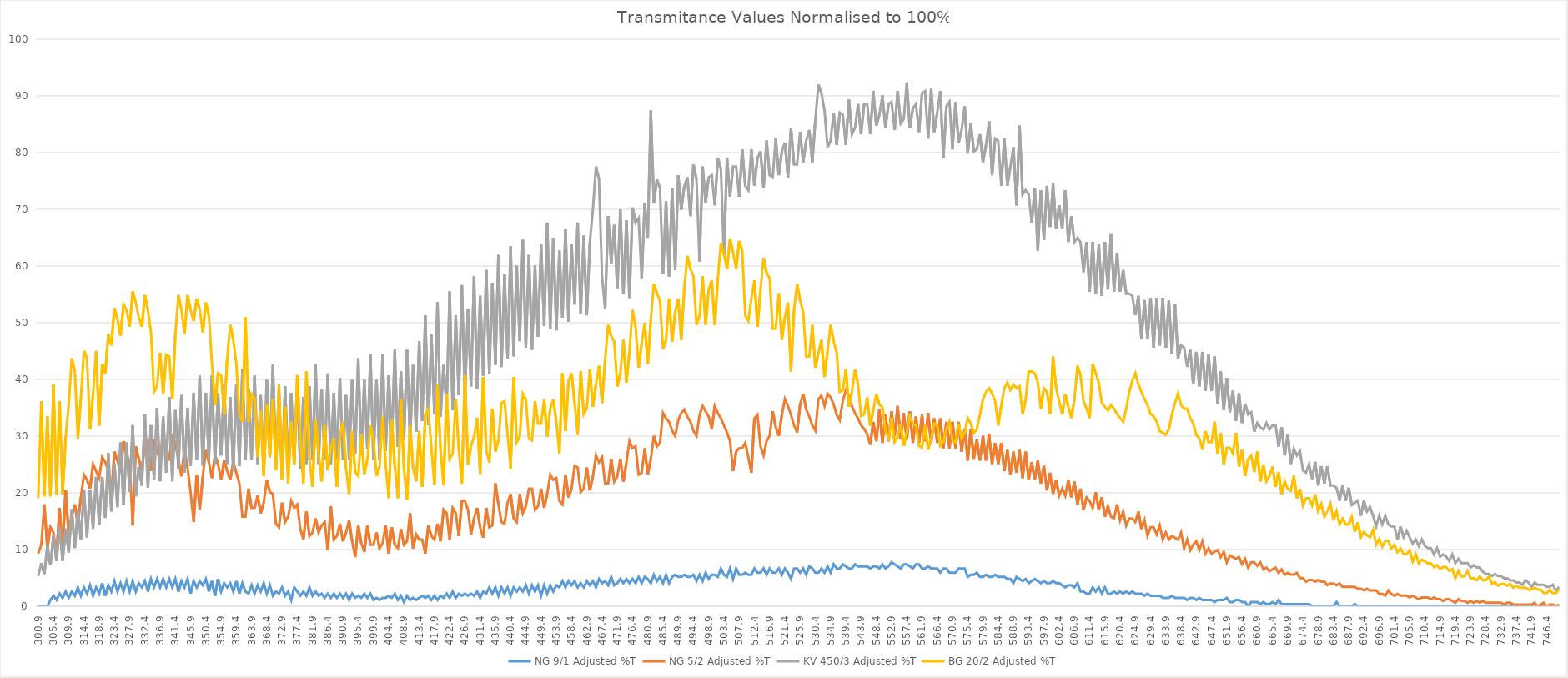
| Category | NG 9/1 | NG 5/2 | KV 450/3 | BG 20/2 |
|---|---|---|---|---|
| 300.90000000001135 | 0 | 9.29 | 5.321 | 19.062 |
| 301.8000000000113 | 0 | 10.838 | 7.602 | 36.151 |
| 302.7000000000113 | 0 | 17.96 | 5.702 | 19.39 |
| 303.6000000000113 | 0 | 10.218 | 10.643 | 33.522 |
| 304.50000000001125 | 1.111 | 13.934 | 7.222 | 19.39 |
| 305.40000000001123 | 1.852 | 13.005 | 12.543 | 39.109 |
| 306.3000000000112 | 1.111 | 8.98 | 7.982 | 19.719 |
| 307.2000000000112 | 2.222 | 17.34 | 14.064 | 36.151 |
| 308.10000000001116 | 1.482 | 10.218 | 7.982 | 19.719 |
| 309.00000000001114 | 2.593 | 20.437 | 13.684 | 29.907 |
| 309.9000000000111 | 1.482 | 12.696 | 9.503 | 35.494 |
| 310.8000000000111 | 2.593 | 15.792 | 17.105 | 43.71 |
| 311.7000000000111 | 1.852 | 17.96 | 10.263 | 41.41 |
| 312.60000000001105 | 3.333 | 14.554 | 17.105 | 29.578 |
| 313.500000000011 | 1.852 | 19.198 | 11.783 | 36.809 |
| 314.400000000011 | 3.333 | 23.224 | 20.525 | 45.025 |
| 315.300000000011 | 2.222 | 22.295 | 12.163 | 43.71 |
| 316.20000000001096 | 3.704 | 20.747 | 20.525 | 31.222 |
| 317.10000000001094 | 1.852 | 25.082 | 13.684 | 37.466 |
| 318.0000000000109 | 3.333 | 23.843 | 22.806 | 45.025 |
| 318.9000000000109 | 2.222 | 22.604 | 14.444 | 31.879 |
| 319.80000000001087 | 4.074 | 26.32 | 22.806 | 42.724 |
| 320.70000000001085 | 1.852 | 25.391 | 15.584 | 41.081 |
| 321.6000000000108 | 3.704 | 23.843 | 26.987 | 47.983 |
| 322.5000000000108 | 2.593 | 19.198 | 16.724 | 46.011 |
| 323.4000000000108 | 4.445 | 27.249 | 25.087 | 52.584 |
| 324.30000000001075 | 2.593 | 25.701 | 17.485 | 50.612 |
| 325.20000000001073 | 4.074 | 23.533 | 28.888 | 47.654 |
| 326.1000000000107 | 2.593 | 29.107 | 17.865 | 53.241 |
| 327.0000000000107 | 4.445 | 26.63 | 28.888 | 52.255 |
| 327.90000000001066 | 2.593 | 25.391 | 20.145 | 49.297 |
| 328.80000000001064 | 4.445 | 14.244 | 31.928 | 55.542 |
| 329.7000000000106 | 2.593 | 28.178 | 19.385 | 53.57 |
| 330.6000000000106 | 4.074 | 26.011 | 24.707 | 50.941 |
| 331.5000000000106 | 3.333 | 23.843 | 21.286 | 49.297 |
| 332.40000000001055 | 4.445 | 28.797 | 33.829 | 54.884 |
| 333.3000000000105 | 2.593 | 29.107 | 20.906 | 52.255 |
| 334.2000000000105 | 4.815 | 23.843 | 31.928 | 48.311 |
| 335.1000000000105 | 3.333 | 29.417 | 22.426 | 37.795 |
| 336.00000000001046 | 4.815 | 27.559 | 34.969 | 38.781 |
| 336.90000000001044 | 3.333 | 25.391 | 22.046 | 44.696 |
| 337.8000000000104 | 4.815 | 30.036 | 33.449 | 37.466 |
| 338.7000000000104 | 3.333 | 28.178 | 23.566 | 44.368 |
| 339.60000000001037 | 4.815 | 25.701 | 36.87 | 44.039 |
| 340.50000000001035 | 3.333 | 30.346 | 22.046 | 36.48 |
| 341.4000000000103 | 4.815 | 28.488 | 34.589 | 47.983 |
| 342.3000000000103 | 2.593 | 26.011 | 24.326 | 54.884 |
| 343.2000000000103 | 4.445 | 22.914 | 37.25 | 52.255 |
| 344.10000000001025 | 3.333 | 27.559 | 23.566 | 47.983 |
| 345.00000000001023 | 4.815 | 24.462 | 34.969 | 54.884 |
| 345.9000000000102 | 2.222 | 20.127 | 24.707 | 52.255 |
| 346.8000000000102 | 4.445 | 14.863 | 37.63 | 50.283 |
| 347.70000000001016 | 3.333 | 23.224 | 25.847 | 54.227 |
| 348.60000000001014 | 4.445 | 17.031 | 40.671 | 52.255 |
| 349.5000000000101 | 3.704 | 22.914 | 24.707 | 48.311 |
| 350.4000000000101 | 4.815 | 27.559 | 37.63 | 53.57 |
| 351.3000000000101 | 2.593 | 25.391 | 25.847 | 51.269 |
| 352.20000000001005 | 4.445 | 22.604 | 40.671 | 42.724 |
| 353.10000000001 | 1.852 | 26.63 | 25.087 | 35.494 |
| 354.00000000001 | 4.815 | 25.082 | 37.63 | 41.081 |
| 354.90000000001 | 2.593 | 22.295 | 26.607 | 40.752 |
| 355.80000000000996 | 4.074 | 25.701 | 39.15 | 33.851 |
| 356.70000000000994 | 3.333 | 23.843 | 25.087 | 43.71 |
| 357.6000000000099 | 4.074 | 22.295 | 36.87 | 49.626 |
| 358.5000000000099 | 2.593 | 25.391 | 23.946 | 46.997 |
| 359.40000000000987 | 4.445 | 23.533 | 39.15 | 42.724 |
| 360.30000000000985 | 2.222 | 21.676 | 24.707 | 33.851 |
| 361.2000000000098 | 4.074 | 15.792 | 41.811 | 32.536 |
| 362.1000000000098 | 2.593 | 15.792 | 25.847 | 50.941 |
| 363.0000000000098 | 2.222 | 20.747 | 38.39 | 32.536 |
| 363.90000000000975 | 3.704 | 17.34 | 25.847 | 37.466 |
| 364.80000000000973 | 2.222 | 17.34 | 40.671 | 36.809 |
| 365.7000000000097 | 3.704 | 19.508 | 25.087 | 26.292 |
| 366.6000000000097 | 2.593 | 16.411 | 37.25 | 34.508 |
| 367.50000000000966 | 4.074 | 18.269 | 23.566 | 23.005 |
| 368.40000000000964 | 2.222 | 22.295 | 39.911 | 35.494 |
| 369.3000000000096 | 3.704 | 20.127 | 26.607 | 26.292 |
| 370.2000000000096 | 1.852 | 19.818 | 42.571 | 36.48 |
| 371.1000000000096 | 2.593 | 14.554 | 24.707 | 23.991 |
| 372.00000000000955 | 2.222 | 13.934 | 38.01 | 39.109 |
| 372.9000000000095 | 3.333 | 18.269 | 22.806 | 22.348 |
| 373.8000000000095 | 1.852 | 14.863 | 38.77 | 35.165 |
| 374.7000000000095 | 2.593 | 15.792 | 24.707 | 21.691 |
| 375.60000000000946 | 1.111 | 18.579 | 37.63 | 32.536 |
| 376.50000000000944 | 3.333 | 17.34 | 25.467 | 24.977 |
| 377.4000000000094 | 2.593 | 17.96 | 38.77 | 40.752 |
| 378.3000000000094 | 1.852 | 13.625 | 24.326 | 29.907 |
| 379.20000000000937 | 2.593 | 11.767 | 36.87 | 21.691 |
| 380.10000000000935 | 1.852 | 16.721 | 25.087 | 41.41 |
| 381.0000000000093 | 3.333 | 12.386 | 38.77 | 25.963 |
| 381.9000000000093 | 1.852 | 13.005 | 25.847 | 21.034 |
| 382.8000000000093 | 2.593 | 15.483 | 42.571 | 32.865 |
| 383.70000000000925 | 1.852 | 13.005 | 25.087 | 26.949 |
| 384.60000000000923 | 2.222 | 14.244 | 38.39 | 22.019 |
| 385.5000000000092 | 1.482 | 14.863 | 25.847 | 31.879 |
| 386.4000000000092 | 2.222 | 9.909 | 41.051 | 23.991 |
| 387.30000000000916 | 1.482 | 17.65 | 25.087 | 27.935 |
| 388.20000000000914 | 2.222 | 11.767 | 37.63 | 29.578 |
| 389.1000000000091 | 1.482 | 12.386 | 25.847 | 21.034 |
| 390.0000000000091 | 2.222 | 14.554 | 40.291 | 30.236 |
| 390.9000000000091 | 1.482 | 11.457 | 25.847 | 32.536 |
| 391.80000000000905 | 2.222 | 13.005 | 37.25 | 24.32 |
| 392.700000000009 | 1.111 | 15.173 | 25.847 | 19.719 |
| 393.600000000009 | 2.222 | 11.457 | 39.911 | 30.893 |
| 394.500000000009 | 1.482 | 8.67 | 26.987 | 23.663 |
| 395.40000000000896 | 1.852 | 14.244 | 43.712 | 23.005 |
| 396.30000000000894 | 1.482 | 11.147 | 26.607 | 30.236 |
| 397.2000000000089 | 2.222 | 9.599 | 39.911 | 23.334 |
| 398.1000000000089 | 1.482 | 14.244 | 27.747 | 25.963 |
| 399.00000000000887 | 2.222 | 10.838 | 44.472 | 31.879 |
| 399.90000000000884 | 1.111 | 10.838 | 25.847 | 29.578 |
| 400.8000000000088 | 1.482 | 13.005 | 39.911 | 23.005 |
| 401.7000000000088 | 1.111 | 10.218 | 25.847 | 24.649 |
| 402.6000000000088 | 1.482 | 11.147 | 44.472 | 33.522 |
| 403.50000000000875 | 1.482 | 14.244 | 27.367 | 24.977 |
| 404.40000000000873 | 1.852 | 9.29 | 40.671 | 19.062 |
| 405.3000000000087 | 1.482 | 13.934 | 28.888 | 32.865 |
| 406.2000000000087 | 2.222 | 10.838 | 45.232 | 24.649 |
| 407.10000000000866 | 1.111 | 10.218 | 28.127 | 19.062 |
| 408.00000000000864 | 1.852 | 13.625 | 41.431 | 36.48 |
| 408.9000000000086 | 0.741 | 10.838 | 29.268 | 24.32 |
| 409.8000000000086 | 1.852 | 11.457 | 45.232 | 18.733 |
| 410.7000000000086 | 1.111 | 16.411 | 29.268 | 31.879 |
| 411.60000000000855 | 1.482 | 10.218 | 42.571 | 24.32 |
| 412.5000000000085 | 1.111 | 12.696 | 30.788 | 22.019 |
| 413.4000000000085 | 1.482 | 11.767 | 46.752 | 30.893 |
| 414.3000000000085 | 1.852 | 11.767 | 32.689 | 21.034 |
| 415.20000000000846 | 1.482 | 9.29 | 51.314 | 33.851 |
| 416.10000000000844 | 1.852 | 14.244 | 31.928 | 34.837 |
| 417.0000000000084 | 1.111 | 12.386 | 47.893 | 27.935 |
| 417.9000000000084 | 1.852 | 11.767 | 33.829 | 21.362 |
| 418.80000000000837 | 1.111 | 14.554 | 53.594 | 39.109 |
| 419.70000000000834 | 1.852 | 11.457 | 33.449 | 27.607 |
| 420.6000000000083 | 1.482 | 17.031 | 42.571 | 21.362 |
| 421.5000000000083 | 2.222 | 16.411 | 35.349 | 37.466 |
| 422.4000000000083 | 1.482 | 11.767 | 55.495 | 25.963 |
| 423.30000000000825 | 2.593 | 17.34 | 34.589 | 26.949 |
| 424.20000000000823 | 1.482 | 16.411 | 51.314 | 36.48 |
| 425.1000000000082 | 2.222 | 12.386 | 37.25 | 27.607 |
| 426.0000000000082 | 1.852 | 18.579 | 56.635 | 21.691 |
| 426.90000000000816 | 2.222 | 18.579 | 36.87 | 40.752 |
| 427.80000000000814 | 1.852 | 17.031 | 52.454 | 24.977 |
| 428.7000000000081 | 2.222 | 12.696 | 38.77 | 28.264 |
| 429.6000000000081 | 1.852 | 15.483 | 58.155 | 29.907 |
| 430.5000000000081 | 2.593 | 17.34 | 38.39 | 33.194 |
| 431.40000000000805 | 1.482 | 13.934 | 54.735 | 23.334 |
| 432.300000000008 | 2.593 | 12.076 | 40.671 | 40.424 |
| 433.200000000008 | 2.222 | 17.34 | 59.296 | 27.607 |
| 434.100000000008 | 3.333 | 13.934 | 41.051 | 25.306 |
| 435.00000000000796 | 2.222 | 14.244 | 57.015 | 34.837 |
| 435.90000000000794 | 3.333 | 21.676 | 42.571 | 27.278 |
| 436.8000000000079 | 1.852 | 17.96 | 61.956 | 29.25 |
| 437.7000000000079 | 3.333 | 14.863 | 42.191 | 35.823 |
| 438.60000000000787 | 2.222 | 14.554 | 58.536 | 36.151 |
| 439.50000000000784 | 3.333 | 18.269 | 43.712 | 30.236 |
| 440.4000000000078 | 1.852 | 19.818 | 63.477 | 24.32 |
| 441.3000000000078 | 3.333 | 15.483 | 44.092 | 40.424 |
| 442.2000000000078 | 2.593 | 14.863 | 60.056 | 28.921 |
| 443.10000000000775 | 3.333 | 19.818 | 46.752 | 29.907 |
| 444.00000000000773 | 2.593 | 16.411 | 64.617 | 37.466 |
| 444.9000000000077 | 3.704 | 17.65 | 45.612 | 36.48 |
| 445.8000000000077 | 2.222 | 20.747 | 61.956 | 29.578 |
| 446.70000000000766 | 3.704 | 20.747 | 45.232 | 29.25 |
| 447.60000000000764 | 2.593 | 17.031 | 60.056 | 36.151 |
| 448.5000000000076 | 3.704 | 17.65 | 47.513 | 32.208 |
| 449.4000000000076 | 1.852 | 20.747 | 63.857 | 32.208 |
| 450.30000000000757 | 3.704 | 17.34 | 49.413 | 36.48 |
| 451.20000000000755 | 2.222 | 19.818 | 67.658 | 29.907 |
| 452.1000000000075 | 3.704 | 23.224 | 49.033 | 34.837 |
| 453.0000000000075 | 2.593 | 22.295 | 64.997 | 36.48 |
| 453.9000000000075 | 3.704 | 22.604 | 48.653 | 32.536 |
| 454.80000000000746 | 3.333 | 18.579 | 62.717 | 26.949 |
| 455.70000000000744 | 4.445 | 17.96 | 50.934 | 41.081 |
| 456.6000000000074 | 3.333 | 23.224 | 66.518 | 30.893 |
| 457.5000000000074 | 4.445 | 19.198 | 50.173 | 39.767 |
| 458.40000000000737 | 3.704 | 20.747 | 63.857 | 41.081 |
| 459.30000000000734 | 4.445 | 24.772 | 53.214 | 35.823 |
| 460.2000000000073 | 3.333 | 24.462 | 67.658 | 30.236 |
| 461.1000000000073 | 4.074 | 20.127 | 51.694 | 41.41 |
| 462.0000000000073 | 3.333 | 20.747 | 65.377 | 33.851 |
| 462.90000000000725 | 4.445 | 24.462 | 51.314 | 34.837 |
| 463.80000000000723 | 3.704 | 20.437 | 64.237 | 41.738 |
| 464.7000000000072 | 4.445 | 22.914 | 69.939 | 35.165 |
| 465.6000000000072 | 3.333 | 26.63 | 77.541 | 39.109 |
| 466.50000000000716 | 4.815 | 25.391 | 75.26 | 42.396 |
| 467.40000000000714 | 4.074 | 26.32 | 58.155 | 35.823 |
| 468.3000000000071 | 4.445 | 21.676 | 52.454 | 43.382 |
| 469.2000000000071 | 3.704 | 21.676 | 68.798 | 49.626 |
| 470.10000000000707 | 5.185 | 26.011 | 60.436 | 47.654 |
| 471.00000000000705 | 3.704 | 21.985 | 67.278 | 46.668 |
| 471.900000000007 | 4.074 | 22.914 | 55.875 | 38.781 |
| 472.800000000007 | 4.815 | 26.011 | 69.939 | 41.081 |
| 473.700000000007 | 4.074 | 21.985 | 55.115 | 46.997 |
| 474.60000000000696 | 4.815 | 25.391 | 68.038 | 39.438 |
| 475.50000000000693 | 4.074 | 29.107 | 54.354 | 45.025 |
| 476.4000000000069 | 4.815 | 27.869 | 70.319 | 52.255 |
| 477.3000000000069 | 4.074 | 28.178 | 67.658 | 49.297 |
| 478.20000000000687 | 5.185 | 23.224 | 68.418 | 42.067 |
| 479.10000000000684 | 4.074 | 23.533 | 57.775 | 46.34 |
| 480.0000000000068 | 5.185 | 27.869 | 71.079 | 49.955 |
| 480.9000000000068 | 4.815 | 23.224 | 64.997 | 42.724 |
| 481.8000000000068 | 4.074 | 26.011 | 87.423 | 50.612 |
| 482.70000000000675 | 5.556 | 30.036 | 71.079 | 56.856 |
| 483.60000000000673 | 4.445 | 28.178 | 75.26 | 55.213 |
| 484.5000000000067 | 5.185 | 28.797 | 73.74 | 53.898 |
| 485.4000000000067 | 4.074 | 34.062 | 58.536 | 45.354 |
| 486.30000000000666 | 5.556 | 33.133 | 71.459 | 46.997 |
| 487.20000000000664 | 4.074 | 32.513 | 58.155 | 54.227 |
| 488.1000000000066 | 5.185 | 30.965 | 73.74 | 46.668 |
| 489.0000000000066 | 5.556 | 30.036 | 59.296 | 51.927 |
| 489.90000000000657 | 5.185 | 32.823 | 76.02 | 54.227 |
| 490.80000000000655 | 5.185 | 34.062 | 69.939 | 46.997 |
| 491.7000000000065 | 5.556 | 34.681 | 74.12 | 56.199 |
| 492.6000000000065 | 5.185 | 33.442 | 75.64 | 61.786 |
| 493.5000000000065 | 5.185 | 32.513 | 68.798 | 59.485 |
| 494.40000000000646 | 5.556 | 30.965 | 77.921 | 58.171 |
| 495.30000000000643 | 4.445 | 30.036 | 75.26 | 49.626 |
| 496.2000000000064 | 5.556 | 33.752 | 60.816 | 51.269 |
| 497.1000000000064 | 4.445 | 35.3 | 77.541 | 58.171 |
| 498.00000000000637 | 5.926 | 34.371 | 71.079 | 49.626 |
| 498.90000000000634 | 4.815 | 33.442 | 75.64 | 55.87 |
| 499.8000000000063 | 5.556 | 31.275 | 76.02 | 57.514 |
| 500.7000000000063 | 5.556 | 35.3 | 70.699 | 49.626 |
| 501.6000000000063 | 5.185 | 34.062 | 79.061 | 57.842 |
| 502.50000000000625 | 6.667 | 33.133 | 77.16 | 64.087 |
| 503.40000000000623 | 5.556 | 31.894 | 61.956 | 62.115 |
| 504.3000000000062 | 5.185 | 30.655 | 79.061 | 59.485 |
| 505.2000000000062 | 6.667 | 29.107 | 72.219 | 64.744 |
| 506.10000000000616 | 4.815 | 23.843 | 77.541 | 62.443 |
| 507.00000000000614 | 6.667 | 27.249 | 77.541 | 59.485 |
| 507.9000000000061 | 5.556 | 27.869 | 72.219 | 64.415 |
| 508.8000000000061 | 5.556 | 27.869 | 80.581 | 62.772 |
| 509.70000000000607 | 5.926 | 28.797 | 74.12 | 51.269 |
| 510.60000000000605 | 5.556 | 26.32 | 73.359 | 50.283 |
| 511.500000000006 | 5.556 | 23.533 | 80.581 | 54.227 |
| 512.400000000006 | 6.667 | 33.133 | 74.12 | 57.514 |
| 513.300000000006 | 5.926 | 33.752 | 79.061 | 49.297 |
| 514.200000000006 | 5.926 | 28.178 | 80.201 | 55.87 |
| 515.1000000000059 | 6.667 | 26.63 | 73.74 | 61.457 |
| 516.0000000000059 | 5.556 | 29.107 | 82.102 | 58.828 |
| 516.9000000000059 | 6.667 | 30.036 | 76.02 | 57.842 |
| 517.8000000000059 | 5.926 | 34.371 | 75.64 | 48.969 |
| 518.7000000000058 | 5.926 | 31.584 | 82.482 | 48.969 |
| 519.6000000000058 | 6.667 | 30.036 | 76.02 | 55.213 |
| 520.5000000000058 | 5.556 | 33.752 | 80.201 | 46.997 |
| 521.4000000000058 | 6.667 | 36.539 | 81.722 | 50.941 |
| 522.3000000000058 | 5.926 | 35.3 | 75.64 | 53.57 |
| 523.2000000000057 | 4.815 | 33.752 | 84.382 | 41.41 |
| 524.1000000000057 | 6.667 | 31.894 | 77.921 | 52.255 |
| 525.0000000000057 | 6.667 | 30.655 | 77.921 | 56.856 |
| 525.9000000000057 | 5.926 | 35.61 | 83.622 | 53.898 |
| 526.8000000000056 | 6.667 | 37.468 | 78.301 | 51.927 |
| 527.7000000000056 | 5.556 | 34.681 | 82.102 | 44.039 |
| 528.6000000000056 | 7.037 | 33.442 | 84.002 | 44.039 |
| 529.5000000000056 | 6.667 | 31.894 | 78.301 | 49.626 |
| 530.4000000000055 | 5.926 | 30.965 | 85.903 | 42.067 |
| 531.3000000000055 | 5.926 | 36.539 | 91.984 | 44.696 |
| 532.2000000000055 | 6.667 | 37.158 | 90.464 | 46.997 |
| 533.1000000000055 | 5.926 | 35.3 | 87.423 | 40.424 |
| 534.0000000000055 | 7.037 | 37.468 | 80.962 | 45.025 |
| 534.9000000000054 | 5.926 | 36.848 | 82.102 | 49.626 |
| 535.8000000000054 | 7.408 | 35.61 | 87.043 | 46.668 |
| 536.7000000000054 | 6.667 | 33.752 | 81.342 | 44.696 |
| 537.6000000000054 | 6.667 | 32.823 | 87.043 | 37.795 |
| 538.5000000000053 | 7.408 | 36.229 | 86.663 | 38.123 |
| 539.4000000000053 | 7.037 | 38.087 | 81.342 | 41.738 |
| 540.3000000000053 | 6.667 | 37.158 | 89.324 | 35.165 |
| 541.2000000000053 | 6.667 | 35.3 | 83.242 | 37.795 |
| 542.1000000000053 | 7.408 | 34.062 | 84.382 | 41.738 |
| 543.0000000000052 | 7.037 | 33.133 | 88.564 | 39.109 |
| 543.9000000000052 | 7.037 | 31.894 | 83.242 | 33.522 |
| 544.8000000000052 | 7.037 | 31.275 | 88.564 | 33.851 |
| 545.7000000000052 | 7.037 | 30.346 | 88.564 | 36.809 |
| 546.6000000000051 | 6.667 | 28.488 | 83.242 | 31.879 |
| 547.5000000000051 | 7.037 | 32.513 | 90.844 | 34.508 |
| 548.4000000000051 | 7.037 | 29.107 | 84.763 | 37.466 |
| 549.3000000000051 | 6.667 | 34.681 | 86.663 | 35.494 |
| 550.200000000005 | 7.408 | 28.797 | 90.084 | 35.165 |
| 551.100000000005 | 6.667 | 33.752 | 84.382 | 30.893 |
| 552.000000000005 | 7.037 | 29.107 | 88.564 | 29.578 |
| 552.900000000005 | 7.778 | 34.371 | 88.944 | 33.194 |
| 553.800000000005 | 7.408 | 30.036 | 84.002 | 28.921 |
| 554.7000000000049 | 7.037 | 35.3 | 90.844 | 29.907 |
| 555.6000000000049 | 6.667 | 29.417 | 85.143 | 32.208 |
| 556.5000000000049 | 7.408 | 34.062 | 85.903 | 28.264 |
| 557.4000000000049 | 7.408 | 29.417 | 92.365 | 30.564 |
| 558.3000000000048 | 7.037 | 34.371 | 84.382 | 33.522 |
| 559.2000000000048 | 6.667 | 28.797 | 87.803 | 32.208 |
| 560.1000000000048 | 7.408 | 33.442 | 88.564 | 31.879 |
| 561.0000000000048 | 7.408 | 28.797 | 83.622 | 28.264 |
| 561.9000000000048 | 6.667 | 33.752 | 90.464 | 27.935 |
| 562.8000000000047 | 6.667 | 29.107 | 90.844 | 31.879 |
| 563.7000000000047 | 7.037 | 34.062 | 82.482 | 27.607 |
| 564.6000000000047 | 6.667 | 28.797 | 91.224 | 29.578 |
| 565.5000000000047 | 6.667 | 33.133 | 83.622 | 32.208 |
| 566.4000000000046 | 6.667 | 28.797 | 87.043 | 31.879 |
| 567.3000000000046 | 5.926 | 33.133 | 90.844 | 28.264 |
| 568.2000000000046 | 6.667 | 27.869 | 79.061 | 28.921 |
| 569.1000000000046 | 6.667 | 32.513 | 88.183 | 31.222 |
| 570.0000000000045 | 5.926 | 27.869 | 88.944 | 32.536 |
| 570.9000000000045 | 5.926 | 32.513 | 80.581 | 29.25 |
| 571.8000000000045 | 5.926 | 27.869 | 88.944 | 28.921 |
| 572.7000000000045 | 6.667 | 32.513 | 81.722 | 32.208 |
| 573.6000000000045 | 6.667 | 27.249 | 84.002 | 29.578 |
| 574.5000000000044 | 6.667 | 31.275 | 88.183 | 30.564 |
| 575.4000000000044 | 5.185 | 25.701 | 79.821 | 33.194 |
| 576.3000000000044 | 5.556 | 31.275 | 85.143 | 32.208 |
| 577.2000000000044 | 5.556 | 26.011 | 80.201 | 30.564 |
| 578.1000000000043 | 5.926 | 29.417 | 80.581 | 31.222 |
| 579.0000000000043 | 5.185 | 25.701 | 83.242 | 33.851 |
| 579.9000000000043 | 5.185 | 30.036 | 78.301 | 36.48 |
| 580.8000000000043 | 5.556 | 25.701 | 81.342 | 37.795 |
| 581.7000000000043 | 5.185 | 30.346 | 85.523 | 38.452 |
| 582.6000000000042 | 5.185 | 25.082 | 76.02 | 37.466 |
| 583.5000000000042 | 5.556 | 28.797 | 82.482 | 36.151 |
| 584.4000000000042 | 5.185 | 25.082 | 82.102 | 31.879 |
| 585.3000000000042 | 5.185 | 28.797 | 74.12 | 35.494 |
| 586.2000000000041 | 5.185 | 23.843 | 82.482 | 38.452 |
| 587.1000000000041 | 4.815 | 27.559 | 74.12 | 39.438 |
| 588.0000000000041 | 4.815 | 23.224 | 77.541 | 38.123 |
| 588.9000000000041 | 4.074 | 27.249 | 80.962 | 39.109 |
| 589.800000000004 | 5.185 | 23.533 | 70.699 | 38.452 |
| 590.700000000004 | 4.815 | 27.559 | 84.763 | 38.781 |
| 591.600000000004 | 4.445 | 22.604 | 72.599 | 33.851 |
| 592.500000000004 | 4.815 | 27.249 | 73.359 | 36.48 |
| 593.400000000004 | 4.074 | 22.295 | 72.599 | 41.41 |
| 594.3000000000039 | 4.445 | 25.391 | 67.658 | 41.41 |
| 595.2000000000039 | 4.815 | 22.295 | 73.74 | 41.081 |
| 596.1000000000039 | 4.445 | 25.701 | 62.717 | 39.438 |
| 597.0000000000039 | 4.074 | 21.676 | 73.359 | 34.837 |
| 597.9000000000038 | 4.445 | 24.772 | 64.617 | 38.452 |
| 598.8000000000038 | 4.074 | 20.437 | 74.12 | 37.795 |
| 599.7000000000038 | 4.074 | 23.533 | 66.898 | 33.851 |
| 600.6000000000038 | 4.445 | 19.818 | 74.5 | 44.039 |
| 601.5000000000038 | 4.074 | 22.295 | 66.518 | 38.452 |
| 602.4000000000037 | 4.074 | 19.508 | 70.699 | 36.151 |
| 603.3000000000037 | 3.704 | 20.747 | 66.518 | 33.851 |
| 604.2000000000037 | 3.333 | 19.508 | 73.359 | 37.466 |
| 605.1000000000037 | 3.704 | 22.295 | 64.237 | 35.165 |
| 606.0000000000036 | 3.704 | 19.198 | 68.798 | 33.194 |
| 606.9000000000036 | 3.333 | 21.985 | 64.237 | 36.48 |
| 607.8000000000036 | 4.074 | 17.96 | 64.997 | 42.396 |
| 608.7000000000036 | 2.593 | 20.747 | 64.237 | 40.752 |
| 609.6000000000035 | 2.593 | 17.031 | 58.916 | 36.151 |
| 610.5000000000035 | 2.222 | 19.198 | 64.237 | 34.837 |
| 611.4000000000035 | 2.222 | 18.579 | 55.495 | 33.194 |
| 612.3000000000035 | 3.333 | 17.34 | 64.237 | 42.724 |
| 613.2000000000035 | 2.593 | 20.127 | 55.115 | 41.081 |
| 614.1000000000034 | 3.333 | 17.031 | 63.857 | 39.438 |
| 615.0000000000034 | 2.222 | 19.198 | 54.735 | 35.823 |
| 615.9000000000034 | 3.333 | 15.792 | 64.237 | 35.165 |
| 616.8000000000034 | 2.222 | 17.65 | 55.875 | 34.508 |
| 617.7000000000033 | 2.222 | 15.792 | 65.757 | 35.494 |
| 618.6000000000033 | 2.593 | 15.483 | 55.495 | 34.837 |
| 619.5000000000033 | 2.222 | 17.96 | 62.337 | 33.851 |
| 620.4000000000033 | 2.593 | 15.173 | 55.495 | 33.194 |
| 621.3000000000033 | 2.222 | 16.721 | 59.296 | 32.536 |
| 622.2000000000032 | 2.593 | 14.244 | 55.115 | 34.837 |
| 623.1000000000032 | 2.222 | 15.483 | 55.115 | 37.795 |
| 624.0000000000032 | 2.593 | 15.483 | 54.735 | 39.767 |
| 624.9000000000032 | 2.222 | 14.863 | 51.314 | 41.081 |
| 625.8000000000031 | 2.222 | 16.721 | 54.735 | 39.109 |
| 626.7000000000031 | 2.222 | 13.625 | 47.133 | 37.795 |
| 627.6000000000031 | 1.852 | 15.173 | 53.974 | 36.48 |
| 628.5000000000031 | 2.222 | 12.386 | 47.133 | 35.494 |
| 629.400000000003 | 1.852 | 13.934 | 54.354 | 33.851 |
| 630.300000000003 | 1.852 | 13.934 | 45.612 | 33.522 |
| 631.200000000003 | 1.852 | 12.696 | 54.354 | 32.536 |
| 632.100000000003 | 1.852 | 14.244 | 45.992 | 30.893 |
| 633.000000000003 | 1.482 | 11.767 | 54.354 | 30.564 |
| 633.9000000000029 | 1.482 | 13.005 | 45.612 | 30.236 |
| 634.8000000000029 | 1.482 | 11.767 | 53.974 | 31.222 |
| 635.7000000000029 | 1.852 | 12.386 | 44.472 | 33.851 |
| 636.6000000000029 | 1.482 | 12.076 | 53.214 | 35.823 |
| 637.5000000000028 | 1.482 | 11.767 | 43.712 | 37.466 |
| 638.4000000000028 | 1.482 | 13.005 | 45.992 | 35.494 |
| 639.3000000000028 | 1.482 | 10.218 | 45.612 | 34.837 |
| 640.2000000000028 | 1.111 | 11.767 | 42.191 | 34.837 |
| 641.1000000000028 | 1.482 | 9.909 | 45.232 | 33.194 |
| 642.0000000000027 | 1.482 | 10.838 | 39.15 | 32.208 |
| 642.9000000000027 | 1.111 | 11.457 | 44.852 | 30.236 |
| 643.8000000000027 | 1.482 | 9.909 | 38.77 | 29.578 |
| 644.7000000000027 | 1.111 | 11.457 | 44.852 | 27.607 |
| 645.6000000000026 | 1.111 | 9.29 | 38.01 | 30.893 |
| 646.5000000000026 | 1.111 | 10.218 | 44.472 | 28.921 |
| 647.4000000000026 | 1.111 | 9.29 | 38.01 | 28.921 |
| 648.3000000000026 | 0.741 | 9.599 | 44.092 | 32.536 |
| 649.2000000000025 | 1.111 | 9.909 | 35.729 | 26.949 |
| 650.1000000000025 | 1.111 | 8.67 | 41.431 | 30.564 |
| 651.0000000000025 | 1.111 | 9.599 | 34.589 | 24.977 |
| 651.9000000000025 | 1.482 | 7.741 | 40.291 | 27.935 |
| 652.8000000000025 | 0.741 | 8.98 | 34.209 | 27.935 |
| 653.7000000000024 | 0.741 | 8.67 | 38.01 | 26.949 |
| 654.6000000000024 | 1.111 | 8.361 | 32.689 | 30.564 |
| 655.5000000000024 | 1.111 | 8.67 | 37.63 | 24.649 |
| 656.4000000000024 | 0.741 | 7.432 | 32.309 | 27.607 |
| 657.3000000000023 | 0.741 | 8.361 | 35.729 | 23.005 |
| 658.2000000000023 | 0 | 6.812 | 33.829 | 25.963 |
| 659.1000000000023 | 0.741 | 7.741 | 34.209 | 26.621 |
| 660.0000000000023 | 0.741 | 7.741 | 30.788 | 23.663 |
| 660.9000000000023 | 0.741 | 7.122 | 32.309 | 27.278 |
| 661.8000000000022 | 0.37 | 7.741 | 31.548 | 22.019 |
| 662.7000000000022 | 0.741 | 6.503 | 31.168 | 24.977 |
| 663.6000000000022 | 0.37 | 6.812 | 32.309 | 22.019 |
| 664.5000000000022 | 0.37 | 6.193 | 31.168 | 23.005 |
| 665.4000000000021 | 0.741 | 6.503 | 31.928 | 24.649 |
| 666.3000000000021 | 0.37 | 6.812 | 31.928 | 21.034 |
| 667.2000000000021 | 1.111 | 5.883 | 28.127 | 23.663 |
| 668.1000000000021 | 0.37 | 6.503 | 31.548 | 19.719 |
| 669.000000000002 | 0.37 | 5.574 | 26.607 | 22.019 |
| 669.900000000002 | 0.37 | 5.883 | 30.408 | 20.705 |
| 670.800000000002 | 0.37 | 5.574 | 25.087 | 20.376 |
| 671.700000000002 | 0.37 | 5.574 | 27.747 | 23.005 |
| 672.600000000002 | 0.37 | 5.883 | 26.607 | 19.062 |
| 673.5000000000019 | 0.37 | 4.954 | 27.367 | 20.705 |
| 674.4000000000019 | 0.37 | 4.954 | 23.946 | 17.747 |
| 675.3000000000019 | 0.37 | 4.335 | 23.566 | 19.062 |
| 676.2000000000019 | 0.37 | 4.645 | 25.087 | 19.062 |
| 677.1000000000018 | 0 | 4.645 | 22.426 | 17.747 |
| 678.0000000000018 | 0 | 4.335 | 25.467 | 19.719 |
| 678.9000000000018 | 0 | 4.645 | 21.286 | 16.761 |
| 679.8000000000018 | 0 | 4.335 | 24.707 | 18.076 |
| 680.7000000000018 | 0 | 4.335 | 21.666 | 15.775 |
| 681.6000000000017 | 0 | 3.716 | 24.707 | 16.761 |
| 682.5000000000017 | 0 | 4.025 | 21.286 | 18.076 |
| 683.4000000000017 | 0 | 4.025 | 21.286 | 15.118 |
| 684.3000000000017 | 0.741 | 3.716 | 20.906 | 16.761 |
| 685.2000000000016 | 0 | 4.025 | 18.625 | 14.461 |
| 686.1000000000016 | 0 | 3.406 | 21.286 | 15.447 |
| 687.0000000000016 | 0 | 3.406 | 18.625 | 14.461 |
| 687.9000000000016 | 0 | 3.406 | 20.906 | 14.461 |
| 688.8000000000015 | 0 | 3.406 | 17.865 | 15.775 |
| 689.7000000000015 | 0.37 | 3.406 | 18.245 | 13.146 |
| 690.6000000000015 | 0 | 3.097 | 18.625 | 14.789 |
| 691.5000000000015 | 0 | 3.097 | 15.964 | 12.16 |
| 692.4000000000015 | 0 | 2.787 | 18.625 | 13.146 |
| 693.3000000000014 | 0 | 3.097 | 16.724 | 12.489 |
| 694.2000000000014 | 0 | 2.787 | 17.485 | 12.16 |
| 695.1000000000014 | 0 | 2.787 | 15.964 | 13.475 |
| 696.0000000000014 | 0 | 2.787 | 14.064 | 10.845 |
| 696.9000000000013 | 0 | 2.168 | 15.964 | 11.831 |
| 697.8000000000013 | 0 | 2.168 | 14.444 | 10.517 |
| 698.7000000000013 | 0 | 1.858 | 15.964 | 11.503 |
| 699.6000000000013 | 0 | 2.787 | 14.444 | 11.503 |
| 700.5000000000013 | 0 | 2.168 | 14.064 | 10.188 |
| 701.4000000000012 | 0 | 1.858 | 14.064 | 10.845 |
| 702.3000000000012 | 0 | 2.168 | 11.783 | 9.531 |
| 703.2000000000012 | 0 | 1.858 | 14.064 | 10.188 |
| 704.1000000000012 | 0 | 1.858 | 12.163 | 9.202 |
| 705.0000000000011 | 0 | 1.858 | 13.304 | 9.202 |
| 705.9000000000011 | 0 | 1.548 | 12.163 | 9.859 |
| 706.8000000000011 | 0 | 1.858 | 11.023 | 7.888 |
| 707.7000000000011 | 0 | 1.548 | 11.783 | 9.202 |
| 708.600000000001 | 0 | 1.239 | 10.643 | 7.559 |
| 709.500000000001 | 0 | 1.548 | 11.783 | 8.216 |
| 710.400000000001 | 0 | 1.548 | 10.643 | 7.888 |
| 711.300000000001 | 0 | 1.548 | 10.263 | 7.559 |
| 712.200000000001 | 0 | 1.239 | 10.263 | 7.559 |
| 713.1000000000009 | 0 | 1.548 | 9.122 | 6.902 |
| 714.0000000000009 | 0 | 1.239 | 10.263 | 7.23 |
| 714.9000000000009 | 0 | 1.239 | 8.742 | 6.573 |
| 715.8000000000009 | 0 | 0.929 | 9.122 | 6.902 |
| 716.7000000000008 | 0 | 1.239 | 8.742 | 6.902 |
| 717.6000000000008 | 0 | 1.239 | 7.982 | 6.244 |
| 718.5000000000008 | 0 | 0.929 | 9.122 | 6.573 |
| 719.4000000000008 | 0 | 0.619 | 7.602 | 4.93 |
| 720.3000000000008 | 0 | 1.239 | 8.362 | 6.244 |
| 721.2000000000007 | 0 | 0.929 | 7.602 | 5.258 |
| 722.1000000000007 | 0 | 0.929 | 7.602 | 5.258 |
| 723.0000000000007 | 0 | 0.619 | 7.602 | 6.244 |
| 723.9000000000007 | 0 | 0.929 | 6.842 | 4.93 |
| 724.8000000000006 | 0 | 0.619 | 7.222 | 4.93 |
| 725.7000000000006 | 0 | 0.929 | 6.842 | 4.601 |
| 726.6000000000006 | 0 | 0.619 | 6.842 | 5.258 |
| 727.5000000000006 | 0 | 0.929 | 6.082 | 4.601 |
| 728.4000000000005 | 0 | 0.619 | 5.702 | 4.601 |
| 729.3000000000005 | 0 | 0.619 | 5.702 | 5.258 |
| 730.2000000000005 | 0 | 0.619 | 5.321 | 3.944 |
| 731.1000000000005 | 0 | 0.619 | 5.702 | 4.272 |
| 732.0000000000005 | 0 | 0.619 | 5.321 | 3.615 |
| 732.9000000000004 | 0 | 0.619 | 5.321 | 3.944 |
| 733.8000000000004 | 0 | 0.31 | 4.941 | 3.944 |
| 734.7000000000004 | 0 | 0.619 | 4.941 | 3.615 |
| 735.6000000000004 | 0 | 0.619 | 4.561 | 3.944 |
| 736.5000000000003 | 0 | 0.31 | 4.561 | 3.286 |
| 737.4000000000003 | 0 | 0.31 | 4.181 | 3.615 |
| 738.3000000000003 | 0 | 0.31 | 4.181 | 3.286 |
| 739.2000000000003 | 0 | 0.31 | 3.801 | 3.286 |
| 740.1000000000003 | 0 | 0.31 | 4.561 | 3.286 |
| 741.0000000000002 | 0 | 0.31 | 4.181 | 2.958 |
| 741.9000000000002 | 0 | 0.31 | 3.421 | 2.958 |
| 742.8000000000002 | 0 | 0.619 | 4.181 | 3.286 |
| 743.7000000000002 | 0 | 0 | 3.801 | 2.958 |
| 744.6000000000001 | 0 | 0.31 | 3.801 | 2.958 |
| 745.5000000000001 | 0 | 0.619 | 3.801 | 2.301 |
| 746.4000000000001 | 0 | 0 | 3.421 | 2.301 |
| 747.3000000000001 | 0 | 0.31 | 3.421 | 2.958 |
| 748.2 | 0 | 0.31 | 3.801 | 2.301 |
| 749.1 | 0 | 0 | 2.661 | 2.301 |
| 750.0 | 0 | 0.31 | 3.421 | 2.958 |